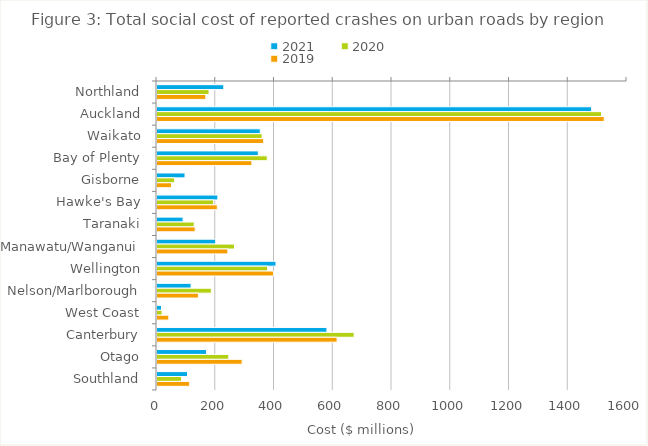
| Category | 2021 | 2020 | 2019 |
|---|---|---|---|
| Northland | 227.393 | 177.036 | 166.105 |
| Auckland | 1479.622 | 1513.265 | 1522.422 |
| Waikato | 351.487 | 357.754 | 363.323 |
| Bay of Plenty | 344.765 | 375.202 | 322.958 |
| Gisborne | 95.419 | 60.123 | 49.544 |
| Hawke's Bay | 207.121 | 192.839 | 205.351 |
| Taranaki | 88.82 | 126.648 | 130.017 |
| Manawatu/Wanganui | 199.903 | 264.014 | 241.18 |
| Wellington | 404.906 | 376.69 | 397.062 |
| Nelson/Marlborough | 115.983 | 184.959 | 141.062 |
| West Coast | 15.353 | 17.376 | 40.186 |
| Canterbury | 578.609 | 670.996 | 613.012 |
| Otago | 168.435 | 244.454 | 289.81 |
| Southland | 103.87 | 83.497 | 110.972 |